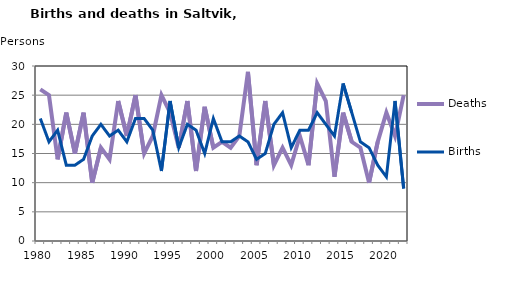
| Category | Deaths | Births |
|---|---|---|
| 1980.0 | 26 | 21 |
| 1981.0 | 25 | 17 |
| 1982.0 | 14 | 19 |
| 1983.0 | 22 | 13 |
| 1984.0 | 15 | 13 |
| 1985.0 | 22 | 14 |
| 1986.0 | 10 | 18 |
| 1987.0 | 16 | 20 |
| 1988.0 | 14 | 18 |
| 1989.0 | 24 | 19 |
| 1990.0 | 18 | 17 |
| 1991.0 | 25 | 21 |
| 1992.0 | 15 | 21 |
| 1993.0 | 18 | 19 |
| 1994.0 | 25 | 12 |
| 1995.0 | 22 | 24 |
| 1996.0 | 16 | 16 |
| 1997.0 | 24 | 20 |
| 1998.0 | 12 | 19 |
| 1999.0 | 23 | 15 |
| 2000.0 | 16 | 21 |
| 2001.0 | 17 | 17 |
| 2002.0 | 16 | 17 |
| 2003.0 | 18 | 18 |
| 2004.0 | 29 | 17 |
| 2005.0 | 13 | 14 |
| 2006.0 | 24 | 15 |
| 2007.0 | 13 | 20 |
| 2008.0 | 16 | 22 |
| 2009.0 | 13 | 16 |
| 2010.0 | 18 | 19 |
| 2011.0 | 13 | 19 |
| 2012.0 | 27 | 22 |
| 2013.0 | 24 | 20 |
| 2014.0 | 11 | 18 |
| 2015.0 | 22 | 27 |
| 2016.0 | 17 | 22 |
| 2017.0 | 16 | 17 |
| 2018.0 | 10 | 16 |
| 2019.0 | 17 | 13 |
| 2020.0 | 22 | 11 |
| 2021.0 | 18 | 24 |
| 2022.0 | 25 | 9 |